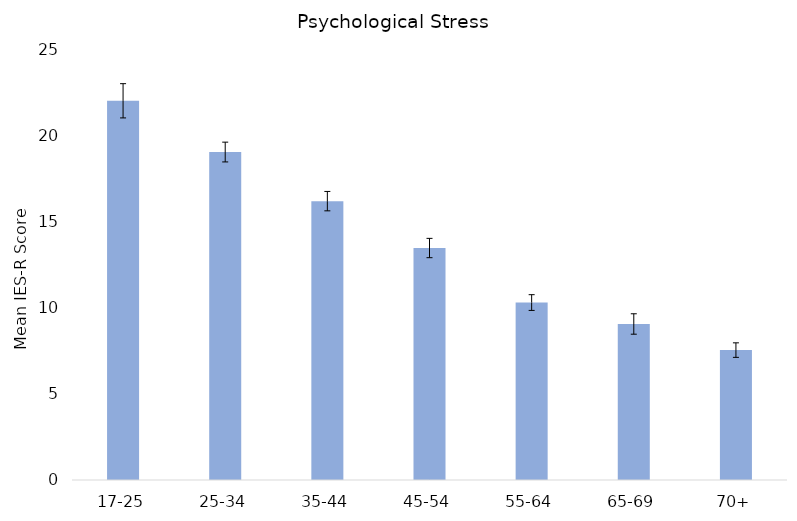
| Category | Mean |
|---|---|
| 17-25 | 22.047 |
| 25-34 | 19.068 |
| 35-44 | 16.213 |
| 45-54 | 13.487 |
| 55-64 | 10.317 |
| 65-69 | 9.071 |
| 70+ | 7.552 |